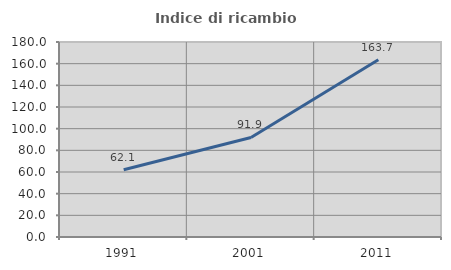
| Category | Indice di ricambio occupazionale  |
|---|---|
| 1991.0 | 62.063 |
| 2001.0 | 91.876 |
| 2011.0 | 163.7 |